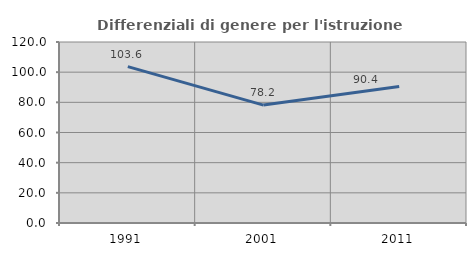
| Category | Differenziali di genere per l'istruzione superiore |
|---|---|
| 1991.0 | 103.638 |
| 2001.0 | 78.183 |
| 2011.0 | 90.432 |